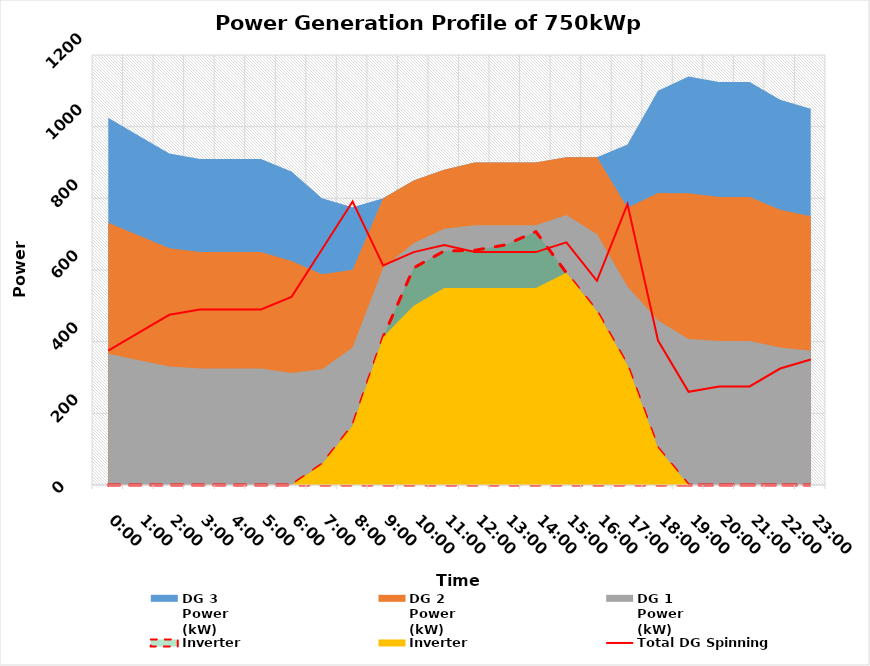
| Category | Total DG Spinning
Reserve
(kW) |
|---|---|
| 0.0 | 375 |
| 0.04166666666667 | 425 |
| 0.08333333333334 | 475 |
| 0.12500000000001 | 490 |
| 0.16666666666668 | 490 |
| 0.20833333333335 | 490 |
| 0.25000000000002 | 525 |
| 0.29166666666669 | 658 |
| 0.33333333333336 | 791 |
| 0.37500000000003 | 613 |
| 0.4166666666667 | 650 |
| 0.45833333333337 | 670 |
| 0.50000000000004 | 650 |
| 0.54166666666671 | 650 |
| 0.58333333333338 | 650 |
| 0.62500000000005 | 677 |
| 0.66666666666672 | 570 |
| 0.70833333333339 | 784 |
| 0.75000000000006 | 403 |
| 0.79166666666673 | 260 |
| 0.8333333333334 | 275 |
| 0.87500000000007 | 275 |
| 0.91666666666674 | 325 |
| 0.95833333333341 | 350 |